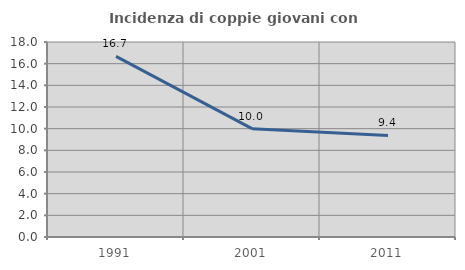
| Category | Incidenza di coppie giovani con figli |
|---|---|
| 1991.0 | 16.667 |
| 2001.0 | 10 |
| 2011.0 | 9.375 |